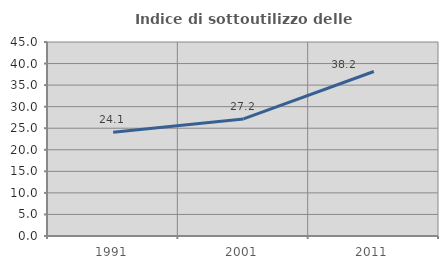
| Category | Indice di sottoutilizzo delle abitazioni  |
|---|---|
| 1991.0 | 24.072 |
| 2001.0 | 27.157 |
| 2011.0 | 38.158 |